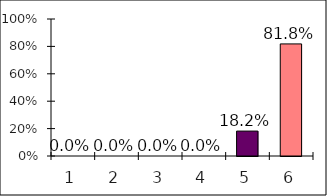
| Category | Series 0 |
|---|---|
| 0 | 0 |
| 1 | 0 |
| 2 | 0 |
| 3 | 0 |
| 4 | 0.182 |
| 5 | 0.818 |